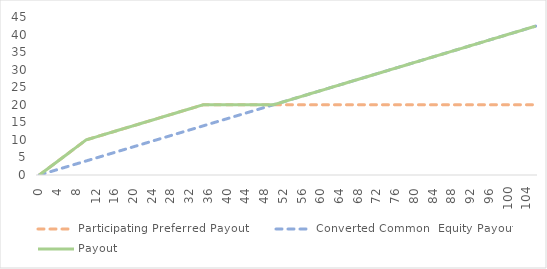
| Category | Participating Preferred Payout | Converted Common  Equity Payout | Payout |
|---|---|---|---|
| 0.0 | 0 | 0 | 0 |
| 1.0 | 1 | 0.4 | 1 |
| 2.0 | 2 | 0.8 | 2 |
| 3.0 | 3 | 1.2 | 3 |
| 4.0 | 4 | 1.6 | 4 |
| 5.0 | 5 | 2 | 5 |
| 6.0 | 6 | 2.4 | 6 |
| 7.0 | 7 | 2.8 | 7 |
| 8.0 | 8 | 3.2 | 8 |
| 9.0 | 9 | 3.6 | 9 |
| 10.0 | 10 | 4 | 10 |
| 11.0 | 10.4 | 4.4 | 10.4 |
| 12.0 | 10.8 | 4.8 | 10.8 |
| 13.0 | 11.2 | 5.2 | 11.2 |
| 14.0 | 11.6 | 5.6 | 11.6 |
| 15.0 | 12 | 6 | 12 |
| 16.0 | 12.4 | 6.4 | 12.4 |
| 17.0 | 12.8 | 6.8 | 12.8 |
| 18.0 | 13.2 | 7.2 | 13.2 |
| 19.0 | 13.6 | 7.6 | 13.6 |
| 20.0 | 14 | 8 | 14 |
| 21.0 | 14.4 | 8.4 | 14.4 |
| 22.0 | 14.8 | 8.8 | 14.8 |
| 23.0 | 15.2 | 9.2 | 15.2 |
| 24.0 | 15.6 | 9.6 | 15.6 |
| 25.0 | 16 | 10 | 16 |
| 26.0 | 16.4 | 10.4 | 16.4 |
| 27.0 | 16.8 | 10.8 | 16.8 |
| 28.0 | 17.2 | 11.2 | 17.2 |
| 29.0 | 17.6 | 11.6 | 17.6 |
| 30.0 | 18 | 12 | 18 |
| 31.0 | 18.4 | 12.4 | 18.4 |
| 32.0 | 18.8 | 12.8 | 18.8 |
| 33.0 | 19.2 | 13.2 | 19.2 |
| 34.0 | 19.6 | 13.6 | 19.6 |
| 35.0 | 20 | 14 | 20 |
| 36.0 | 20 | 14.4 | 20 |
| 37.0 | 20 | 14.8 | 20 |
| 38.0 | 20 | 15.2 | 20 |
| 39.0 | 20 | 15.6 | 20 |
| 40.0 | 20 | 16 | 20 |
| 41.0 | 20 | 16.4 | 20 |
| 42.0 | 20 | 16.8 | 20 |
| 43.0 | 20 | 17.2 | 20 |
| 44.0 | 20 | 17.6 | 20 |
| 45.0 | 20 | 18 | 20 |
| 46.0 | 20 | 18.4 | 20 |
| 47.0 | 20 | 18.8 | 20 |
| 48.0 | 20 | 19.2 | 20 |
| 49.0 | 20 | 19.6 | 20 |
| 50.0 | 20 | 20 | 20 |
| 51.0 | 20 | 20.4 | 20.4 |
| 52.0 | 20 | 20.8 | 20.8 |
| 53.0 | 20 | 21.2 | 21.2 |
| 54.0 | 20 | 21.6 | 21.6 |
| 55.0 | 20 | 22 | 22 |
| 56.0 | 20 | 22.4 | 22.4 |
| 57.0 | 20 | 22.8 | 22.8 |
| 58.0 | 20 | 23.2 | 23.2 |
| 59.0 | 20 | 23.6 | 23.6 |
| 60.0 | 20 | 24 | 24 |
| 61.0 | 20 | 24.4 | 24.4 |
| 62.0 | 20 | 24.8 | 24.8 |
| 63.0 | 20 | 25.2 | 25.2 |
| 64.0 | 20 | 25.6 | 25.6 |
| 65.0 | 20 | 26 | 26 |
| 66.0 | 20 | 26.4 | 26.4 |
| 67.0 | 20 | 26.8 | 26.8 |
| 68.0 | 20 | 27.2 | 27.2 |
| 69.0 | 20 | 27.6 | 27.6 |
| 70.0 | 20 | 28 | 28 |
| 71.0 | 20 | 28.4 | 28.4 |
| 72.0 | 20 | 28.8 | 28.8 |
| 73.0 | 20 | 29.2 | 29.2 |
| 74.0 | 20 | 29.6 | 29.6 |
| 75.0 | 20 | 30 | 30 |
| 76.0 | 20 | 30.4 | 30.4 |
| 77.0 | 20 | 30.8 | 30.8 |
| 78.0 | 20 | 31.2 | 31.2 |
| 79.0 | 20 | 31.6 | 31.6 |
| 80.0 | 20 | 32 | 32 |
| 81.0 | 20 | 32.4 | 32.4 |
| 82.0 | 20 | 32.8 | 32.8 |
| 83.0 | 20 | 33.2 | 33.2 |
| 84.0 | 20 | 33.6 | 33.6 |
| 85.0 | 20 | 34 | 34 |
| 86.0 | 20 | 34.4 | 34.4 |
| 87.0 | 20 | 34.8 | 34.8 |
| 88.0 | 20 | 35.2 | 35.2 |
| 89.0 | 20 | 35.6 | 35.6 |
| 90.0 | 20 | 36 | 36 |
| 91.0 | 20 | 36.4 | 36.4 |
| 92.0 | 20 | 36.8 | 36.8 |
| 93.0 | 20 | 37.2 | 37.2 |
| 94.0 | 20 | 37.6 | 37.6 |
| 95.0 | 20 | 38 | 38 |
| 96.0 | 20 | 38.4 | 38.4 |
| 97.0 | 20 | 38.8 | 38.8 |
| 98.0 | 20 | 39.2 | 39.2 |
| 99.0 | 20 | 39.6 | 39.6 |
| 100.0 | 20 | 40 | 40 |
| 101.0 | 20 | 40.4 | 40.4 |
| 102.0 | 20 | 40.8 | 40.8 |
| 103.0 | 20 | 41.2 | 41.2 |
| 104.0 | 20 | 41.6 | 41.6 |
| 105.0 | 20 | 42 | 42 |
| 106.0 | 20 | 42.4 | 42.4 |